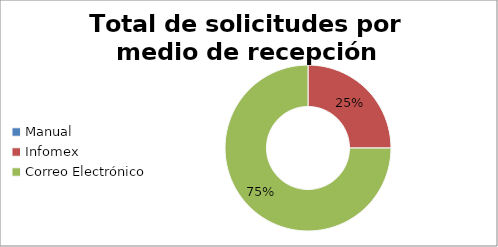
| Category | totales |
|---|---|
| Manual | 0 |
| Infomex | 2 |
| Correo Electrónico | 6 |